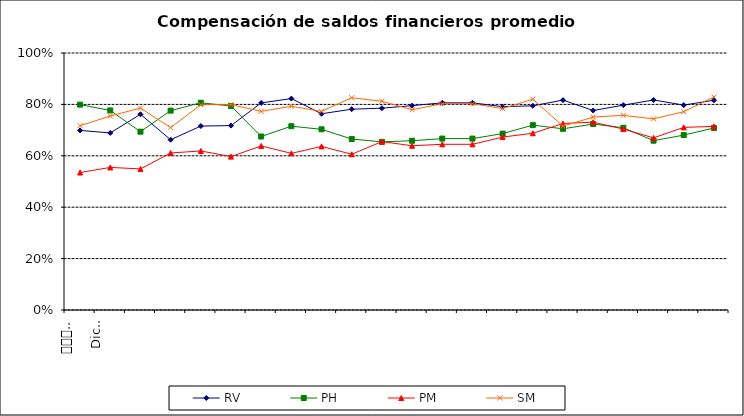
| Category | RV | PH | PM | SM |
|---|---|---|---|---|
| 0 | 0.699 | 0.799 | 0.535 | 0.717 |
| 1 | 0.689 | 0.776 | 0.555 | 0.755 |
| 2 | 0.762 | 0.694 | 0.549 | 0.786 |
| 3 | 0.662 | 0.776 | 0.611 | 0.71 |
| 4 | 0.716 | 0.806 | 0.619 | 0.799 |
| 5 | 0.718 | 0.794 | 0.597 | 0.799 |
| 6 | 0.806 | 0.675 | 0.638 | 0.773 |
| 7 | 0.823 | 0.715 | 0.61 | 0.793 |
| 8 | 0.764 | 0.703 | 0.637 | 0.773 |
| 9 | 0.781 | 0.665 | 0.606 | 0.826 |
| 10 | 0.785 | 0.654 | 0.655 | 0.812 |
| 11 | 0.795 | 0.659 | 0.639 | 0.779 |
| 12 | 0.806 | 0.667 | 0.645 | 0.803 |
| 13 | 0.806 | 0.667 | 0.645 | 0.803 |
| 14 | 0.791 | 0.686 | 0.673 | 0.784 |
| 15 | 0.794 | 0.719 | 0.688 | 0.82 |
| 16 | 0.817 | 0.705 | 0.726 | 0.715 |
| 17 | 0.776 | 0.724 | 0.731 | 0.751 |
| 18 | 0.797 | 0.709 | 0.704 | 0.758 |
| 19 | 0.817 | 0.659 | 0.67 | 0.744 |
| 20 | 0.797 | 0.681 | 0.711 | 0.772 |
| 21 | 0.816 | 0.708 | 0.715 | 0.829 |